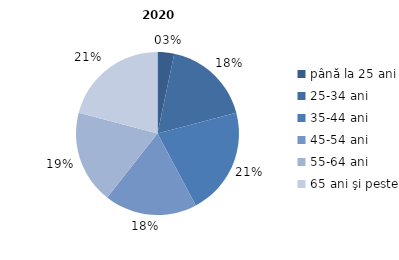
| Category | Series 0 |
|---|---|
| până la 25 ani | 3.3 |
| 25-34 ani | 17.6 |
| 35-44 ani | 21.3 |
| 45-54 ani | 18.4 |
| 55-64 ani | 18.5 |
| 65 ani şi peste | 20.9 |